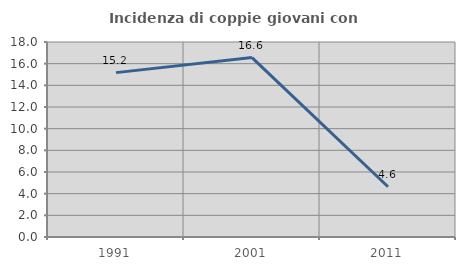
| Category | Incidenza di coppie giovani con figli |
|---|---|
| 1991.0 | 15.172 |
| 2001.0 | 16.561 |
| 2011.0 | 4.636 |